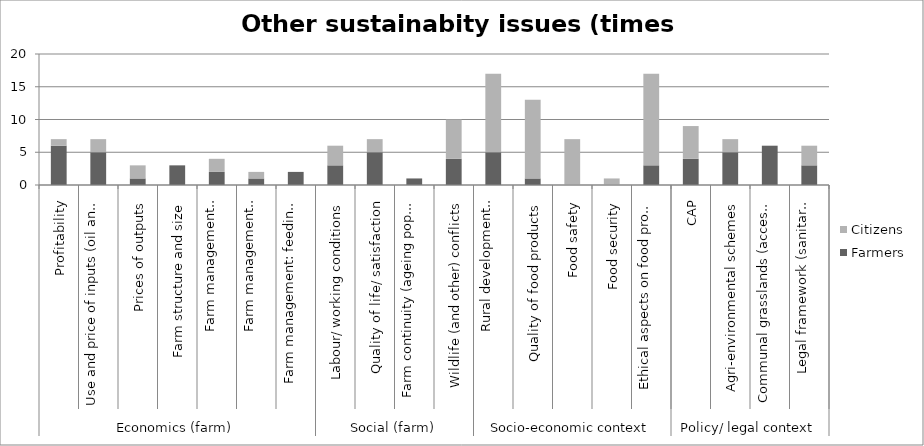
| Category | Farmers | Citizens |
|---|---|---|
| 0 | 6 | 1 |
| 1 | 5 | 2 |
| 2 | 1 | 2 |
| 3 | 3 | 0 |
| 4 | 2 | 2 |
| 5 | 1 | 1 |
| 6 | 2 | 0 |
| 7 | 3 | 3 |
| 8 | 5 | 2 |
| 9 | 1 | 0 |
| 10 | 4 | 6 |
| 11 | 5 | 12 |
| 12 | 1 | 12 |
| 13 | 0 | 7 |
| 14 | 0 | 1 |
| 15 | 3 | 14 |
| 16 | 4 | 5 |
| 17 | 5 | 2 |
| 18 | 6 | 0 |
| 19 | 3 | 3 |